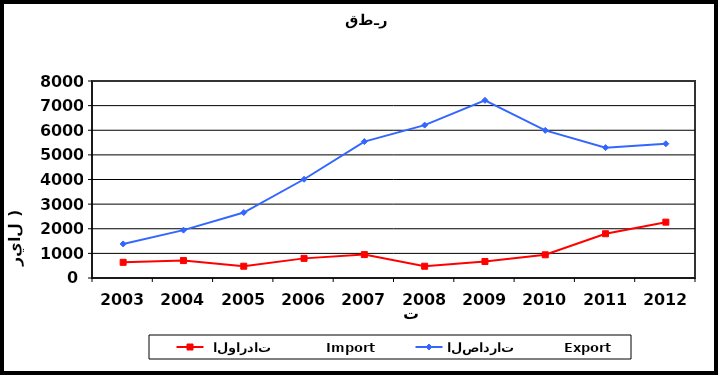
| Category |  الواردات           Import | الصادرات          Export |
|---|---|---|
| 2003.0 | 637 | 1383 |
| 2004.0 | 708 | 1944 |
| 2005.0 | 478 | 2659 |
| 2006.0 | 797 | 4010 |
| 2007.0 | 950 | 5540 |
| 2008.0 | 478 | 6209 |
| 2009.0 | 669 | 7216 |
| 2010.0 | 942 | 5996 |
| 2011.0 | 1797 | 5294 |
| 2012.0 | 2268 | 5452 |